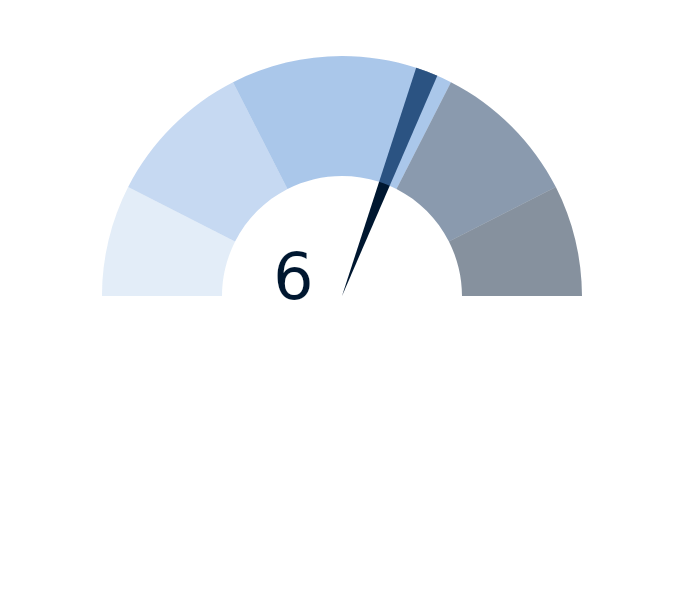
| Category | Series 2 |
|---|---|
| 0 | 6 |
| 1 | 0.3 |
| 2 | 13.7 |